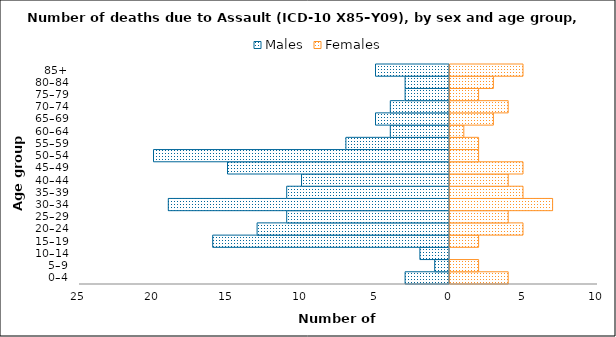
| Category | Males | Females |
|---|---|---|
| 0–4 | -3 | 4 |
| 5–9 | -1 | 2 |
| 10–14 | -2 | 0 |
| 15–19 | -16 | 2 |
| 20–24 | -13 | 5 |
| 25–29 | -11 | 4 |
| 30–34 | -19 | 7 |
| 35–39 | -11 | 5 |
| 40–44 | -10 | 4 |
| 45–49 | -15 | 5 |
| 50–54 | -20 | 2 |
| 55–59 | -7 | 2 |
| 60–64 | -4 | 1 |
| 65–69 | -5 | 3 |
| 70–74 | -4 | 4 |
| 75–79 | -3 | 2 |
| 80–84 | -3 | 3 |
| 85+ | -5 | 5 |